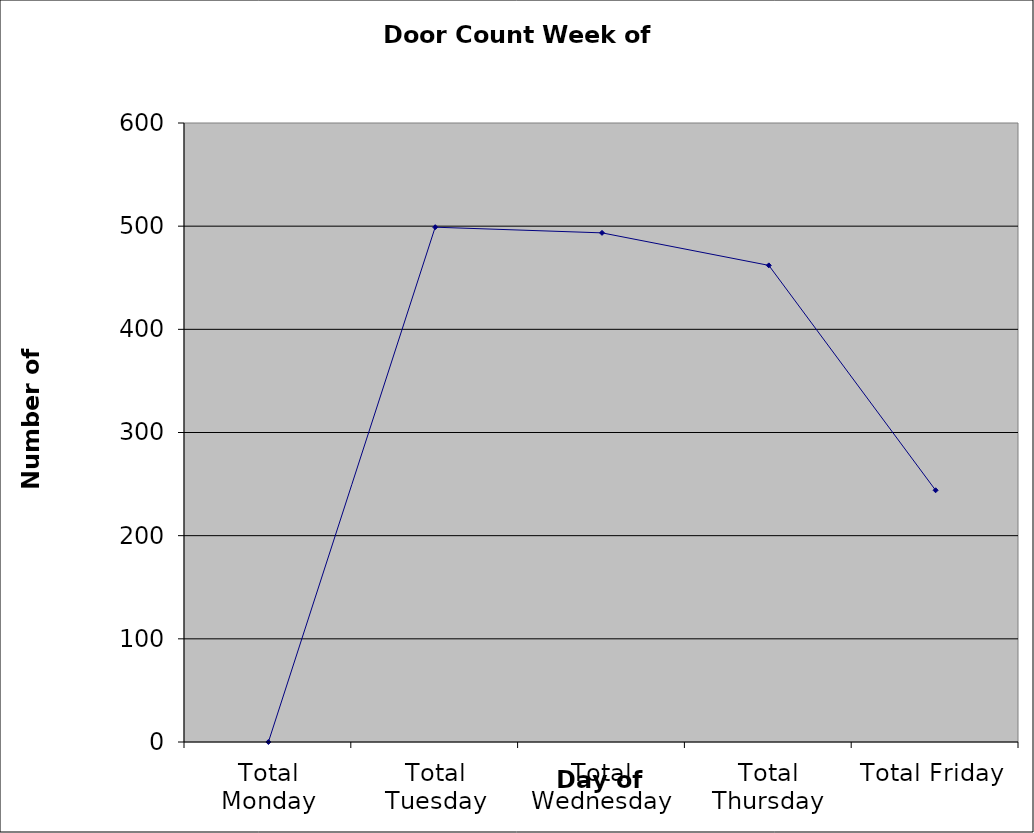
| Category | Series 0 |
|---|---|
| Total Monday | 0 |
| Total Tuesday | 499 |
| Total Wednesday | 493.5 |
| Total Thursday | 462 |
| Total Friday | 244 |